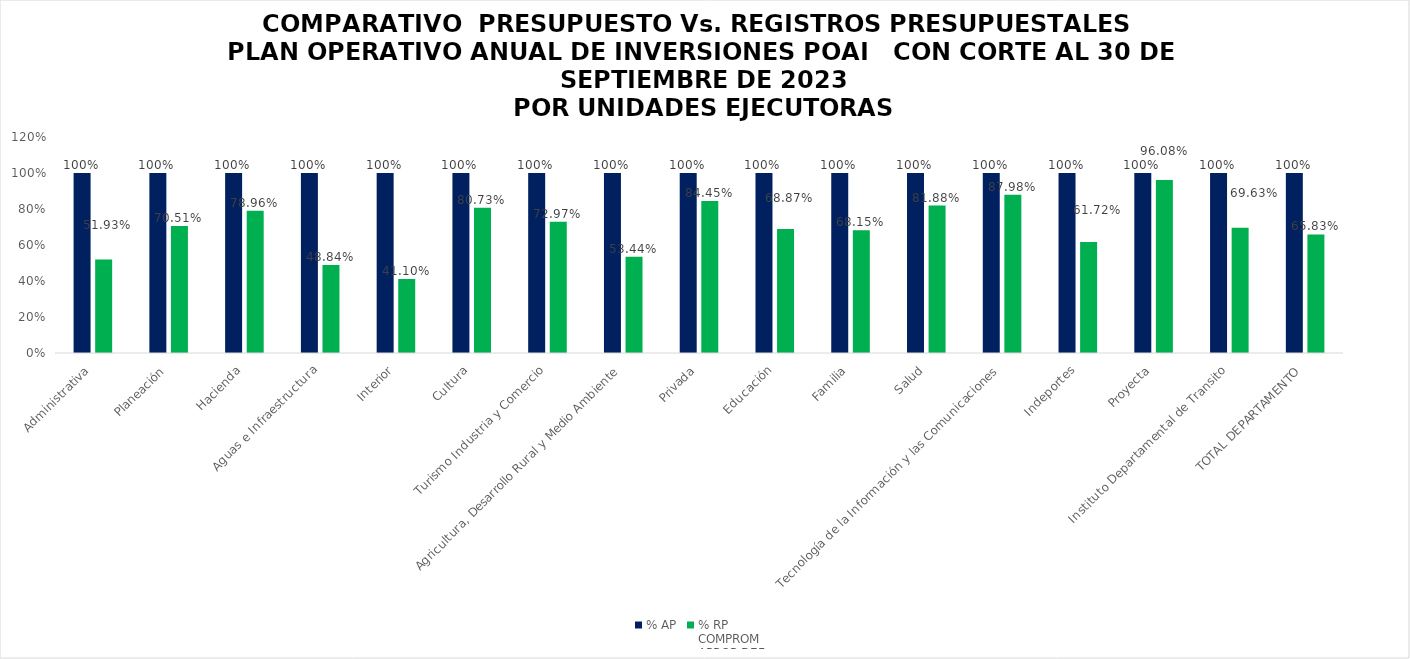
| Category | % AP | % RP
COMPROM
APROP DEF |
|---|---|---|
| Administrativa | 1 | 0.519 |
| Planeación | 1 | 0.705 |
| Hacienda | 1 | 0.79 |
| Aguas e Infraestructura | 1 | 0.488 |
| Interior | 1 | 0.411 |
| Cultura | 1 | 0.807 |
| Turismo Industria y Comercio | 1 | 0.73 |
| Agricultura, Desarrollo Rural y Medio Ambiente | 1 | 0.534 |
| Privada | 1 | 0.844 |
| Educación | 1 | 0.689 |
| Familia | 1 | 0.681 |
| Salud | 1 | 0.819 |
| Tecnología de la Información y las Comunicaciones | 1 | 0.88 |
| Indeportes | 1 | 0.617 |
| Proyecta | 1 | 0.961 |
| Instituto Departamental de Transito | 1 | 0.696 |
| TOTAL DEPARTAMENTO | 1 | 0.658 |